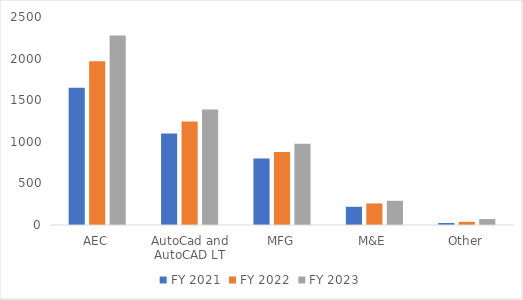
| Category | FY 2021 | FY 2022 | FY 2023 |
|---|---|---|---|
| AEC | 1649 | 1969 | 2278 |
| AutoCad and AutoCAD LT | 1099 | 1244 | 1387 |
| MFG | 799 | 876 | 978 |
| M&E | 219 | 259 | 291 |
| Other | 24 | 38 | 71 |